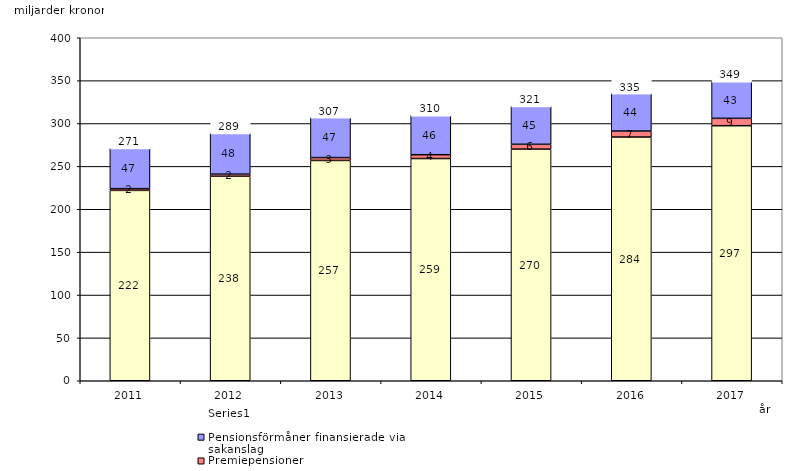
| Category | Inkomstpension och tilläggspension m.m. | Premiepensioner | Pensionsförmåner finansierade via sakanslag | Series 0 |
|---|---|---|---|---|
| 2011.0 | 222.004 | 2.022 | 47.319 | 20 |
| 2012.0 | 238.478 | 2.465 | 48.024 | 20 |
| 2013.0 | 256.892 | 3.382 | 46.957 | 20 |
| 2014.0 | 259.146 | 4.453 | 46.164 | 20 |
| 2015.0 | 270.138 | 5.621 | 44.784 | 20 |
| 2016.0 | 284.222 | 6.982 | 43.929 | 20 |
| 2017.0 | 297.446 | 8.588 | 43.297 | 20 |